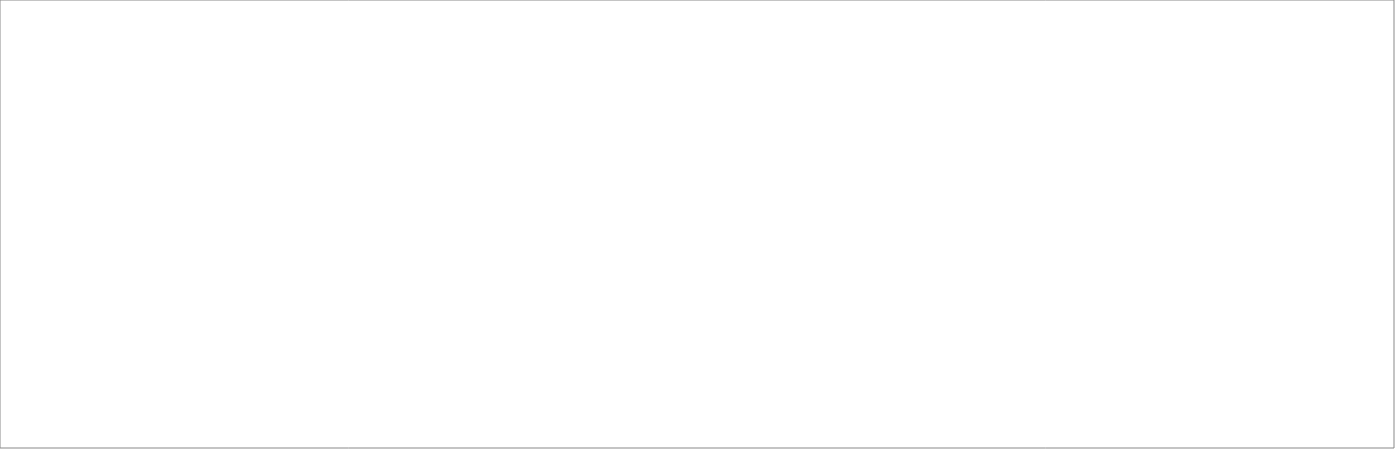
| Category | Elaboracion de alimentos, bebidas y tabaco | Fabricación de textiles, prendas de vestir, cuero y calzado | Aserrado y productos de madera, papel, edición e impresión | Fabricación de productos de la refinación de petróleo; sustancias y productos químicos | Fabricación de productos de caucho y plástico; otros minerales no metálicos | Productos metálicos, maquinaria y equipo | Fabricación de muebles, otras industrias manufactureras y reciclamiento |
|---|---|---|---|---|---|---|---|
| 2018_I | 16200.181 | 3247.137 | 1047.466 | 1601.131 | 1967.903 | 1144.619 | 1002.011 |
| 2018_II | 14574.381 | 3277.172 | 978.301 | 1853.128 | 2267.015 | 1108.608 | 1031.778 |
| 2018_III | 16337.645 | 3208.562 | 1101.492 | 1731.822 | 2253.899 | 1207.307 | 875.325 |
| 2018_IV | 17101.525 | 3054.022 | 1146.492 | 1657.556 | 2323.503 | 1226.456 | 792.681 |
| 2019_I | 16856.854 | 3372.792 | 1119.769 | 1655.518 | 2087.366 | 1186.478 | 1053.611 |
| 2019_II | 15469.124 | 3307.323 | 1080.292 | 1914.213 | 2292.436 | 1158.471 | 1101.4 |
| 2019_III | 0 | 0 | 0 | 0 | 0 | 0 | 0 |
| 2019_IV | 0 | 0 | 0 | 0 | 0 | 0 | 0 |